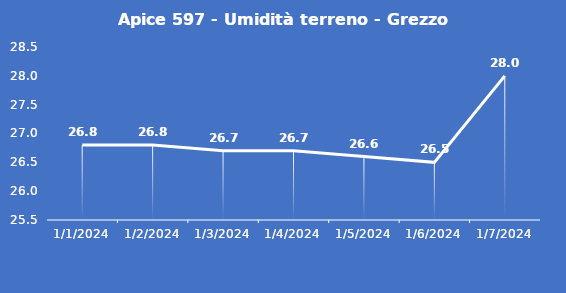
| Category | Apice 597 - Umidità terreno - Grezzo (%VWC) |
|---|---|
| 1/1/24 | 26.8 |
| 1/2/24 | 26.8 |
| 1/3/24 | 26.7 |
| 1/4/24 | 26.7 |
| 1/5/24 | 26.6 |
| 1/6/24 | 26.5 |
| 1/7/24 | 28 |